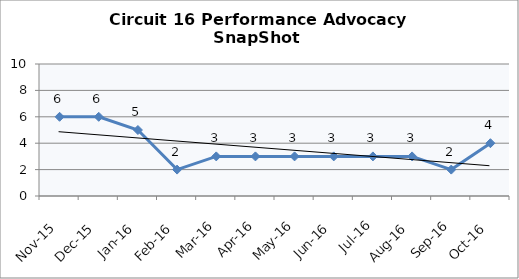
| Category | Circuit 16 |
|---|---|
| Nov-15 | 6 |
| Dec-15 | 6 |
| Jan-16 | 5 |
| Feb-16 | 2 |
| Mar-16 | 3 |
| Apr-16 | 3 |
| May-16 | 3 |
| Jun-16 | 3 |
| Jul-16 | 3 |
| Aug-16 | 3 |
| Sep-16 | 2 |
| Oct-16 | 4 |